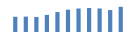
| Category | Exportações (1) |
|---|---|
| 0 | 203692.629 |
| 1 | 204985.899 |
| 2 | 199789.293 |
| 3 | 228223.553 |
| 4 | 265930.688 |
| 5 | 297477.923 |
| 6 | 313201.621 |
| 7 | 319331.634 |
| 8 | 313646.514 |
| 9 | 292733.264 |
| 10 | 335910.984 |